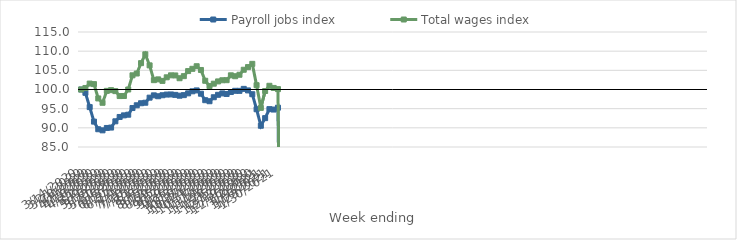
| Category | Payroll jobs index | Total wages index |
|---|---|---|
| 14/03/2020 | 100 | 100 |
| 21/03/2020 | 99.132 | 100.396 |
| 28/03/2020 | 95.408 | 101.548 |
| 04/04/2020 | 91.621 | 101.404 |
| 11/04/2020 | 89.632 | 97.669 |
| 18/04/2020 | 89.346 | 96.537 |
| 25/04/2020 | 89.968 | 99.642 |
| 02/05/2020 | 90.07 | 99.825 |
| 09/05/2020 | 91.704 | 99.573 |
| 16/05/2020 | 92.831 | 98.29 |
| 23/05/2020 | 93.25 | 98.308 |
| 30/05/2020 | 93.423 | 99.999 |
| 06/06/2020 | 95.164 | 103.7 |
| 13/06/2020 | 95.883 | 104.168 |
| 20/06/2020 | 96.415 | 106.876 |
| 27/06/2020 | 96.551 | 109.18 |
| 04/07/2020 | 97.873 | 106.294 |
| 11/07/2020 | 98.473 | 102.437 |
| 18/07/2020 | 98.24 | 102.643 |
| 25/07/2020 | 98.501 | 102.244 |
| 01/08/2020 | 98.681 | 103.181 |
| 08/08/2020 | 98.71 | 103.696 |
| 15/08/2020 | 98.595 | 103.665 |
| 22/08/2020 | 98.384 | 102.941 |
| 29/08/2020 | 98.531 | 103.482 |
| 05/09/2020 | 98.996 | 104.802 |
| 12/09/2020 | 99.529 | 105.394 |
| 19/09/2020 | 99.763 | 106.072 |
| 26/09/2020 | 98.9 | 105.093 |
| 03/10/2020 | 97.212 | 102.275 |
| 10/10/2020 | 96.94 | 100.895 |
| 17/10/2020 | 97.98 | 101.52 |
| 24/10/2020 | 98.615 | 102.11 |
| 31/10/2020 | 98.981 | 102.412 |
| 07/11/2020 | 98.833 | 102.433 |
| 14/11/2020 | 99.342 | 103.698 |
| 21/11/2020 | 99.66 | 103.463 |
| 28/11/2020 | 99.647 | 103.844 |
| 05/12/2020 | 100.165 | 105.149 |
| 12/12/2020 | 99.762 | 105.848 |
| 19/12/2020 | 98.767 | 106.691 |
| 26/12/2020 | 94.85 | 101.122 |
| 02/01/2021 | 90.543 | 95.213 |
| 09/01/2021 | 92.53 | 99.606 |
| 16/01/2021 | 94.879 | 100.967 |
| 23/01/2021 | 94.768 | 100.408 |
| 30/01/2021 | 95.258 | 100.098 |